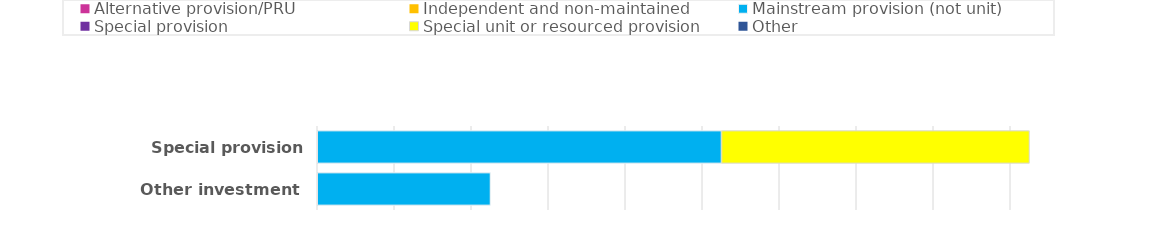
| Category | Alternative provision/PRU | Independent and non-maintained | Mainstream provision (not unit) | Special provision | Special unit or resourced provision | Other |
|---|---|---|---|---|---|---|
| Special provision fund | 0 | 0 | 105000 | 0 | 80000 | 0 |
| Other investment | 0 | 0 | 45000 | 0 | 0 | 0 |